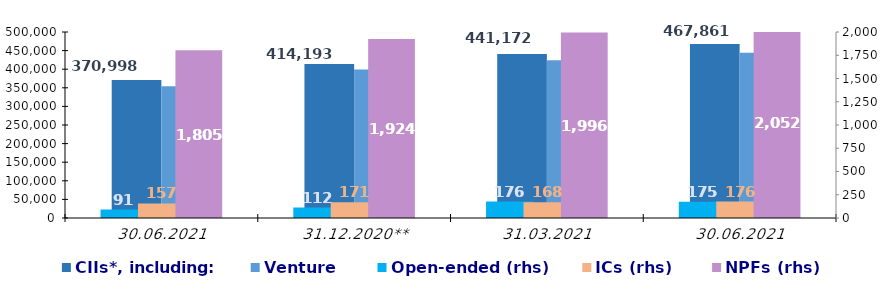
| Category | CIIs*, including: | Venture |
|---|---|---|
| 30.06.2021 | 370998.12 | 354500.31 |
| 31.12.2020** | 414192.85 | 399103.17 |
| 31.03.2021 | 441172.31 | 423794.79 |
| 30.06.2021 | 467860.58 | 444027.69 |